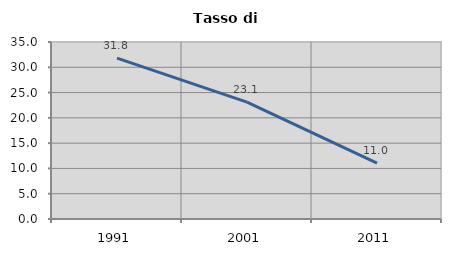
| Category | Tasso di disoccupazione   |
|---|---|
| 1991.0 | 31.799 |
| 2001.0 | 23.122 |
| 2011.0 | 11.049 |